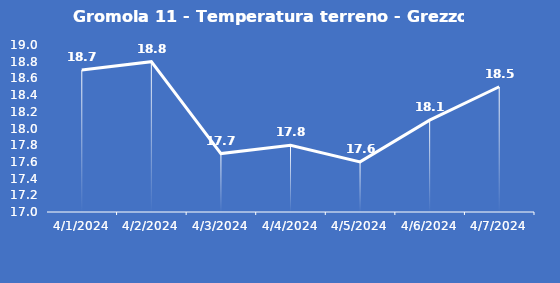
| Category | Gromola 11 - Temperatura terreno - Grezzo (°C) |
|---|---|
| 4/1/24 | 18.7 |
| 4/2/24 | 18.8 |
| 4/3/24 | 17.7 |
| 4/4/24 | 17.8 |
| 4/5/24 | 17.6 |
| 4/6/24 | 18.1 |
| 4/7/24 | 18.5 |